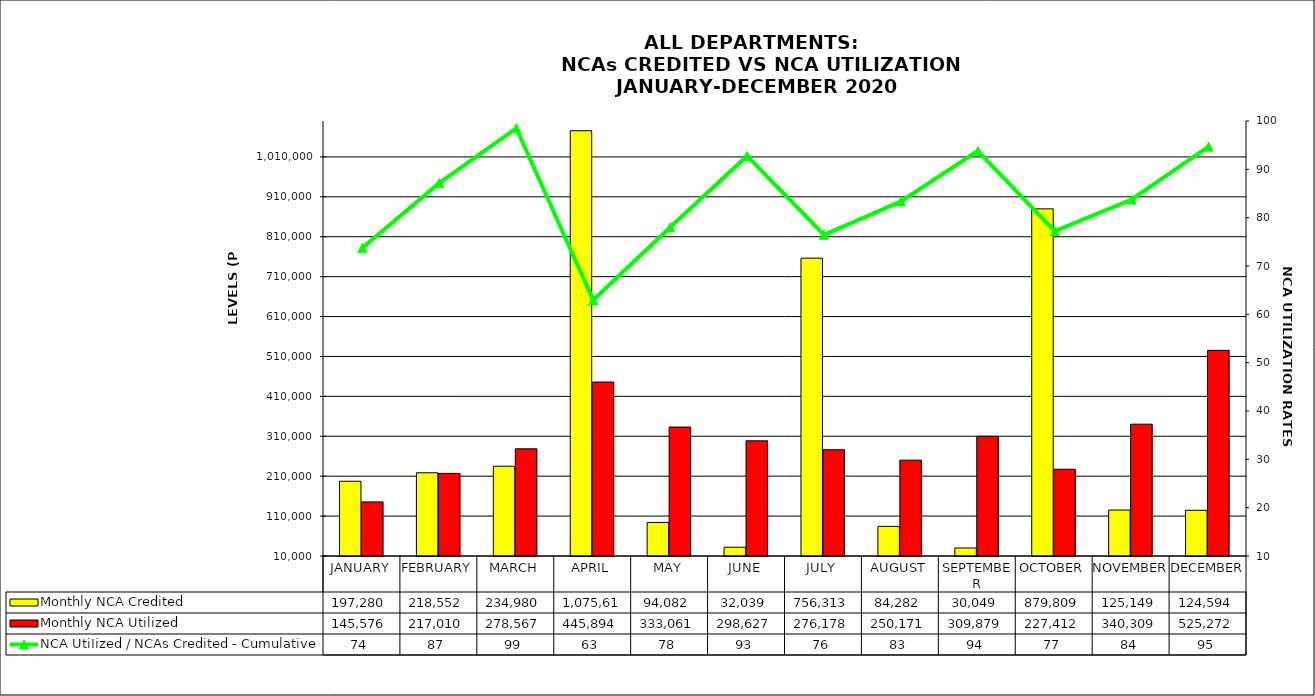
| Category | Monthly NCA Credited | Monthly NCA Utilized |
|---|---|---|
| JANUARY | 197280.374 | 145576.105 |
| FEBRUARY | 218551.98 | 217009.915 |
| MARCH | 234979.639 | 278567.463 |
| APRIL | 1075614.497 | 445894.359 |
| MAY | 94082.131 | 333061.393 |
| JUNE | 32038.674 | 298626.93 |
| JULY | 756312.933 | 276177.539 |
| AUGUST | 84282.483 | 250170.732 |
| SEPTEMBER | 30049.258 | 309878.518 |
| OCTOBER | 879809.114 | 227412.303 |
| NOVEMBER | 125149.366 | 340308.604 |
| DECEMBER | 124593.831 | 525271.602 |